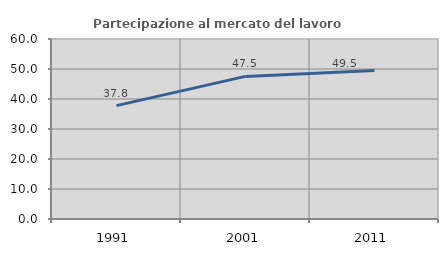
| Category | Partecipazione al mercato del lavoro  femminile |
|---|---|
| 1991.0 | 37.797 |
| 2001.0 | 47.534 |
| 2011.0 | 49.531 |